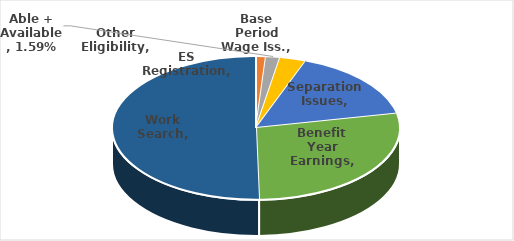
| Category | Series 0 |
|---|---|
| Base Period Wage Iss. | 0.001 |
| Other Eligibility | 0.01 |
| Able + Available | 0.016 |
| ES Registration | 0.03 |
| Separation Issues | 0.161 |
| Benefit Year Earnings | 0.279 |
| Work Search | 0.503 |